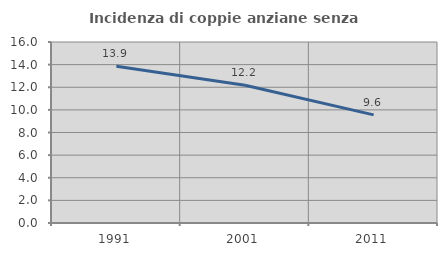
| Category | Incidenza di coppie anziane senza figli  |
|---|---|
| 1991.0 | 13.855 |
| 2001.0 | 12.179 |
| 2011.0 | 9.559 |